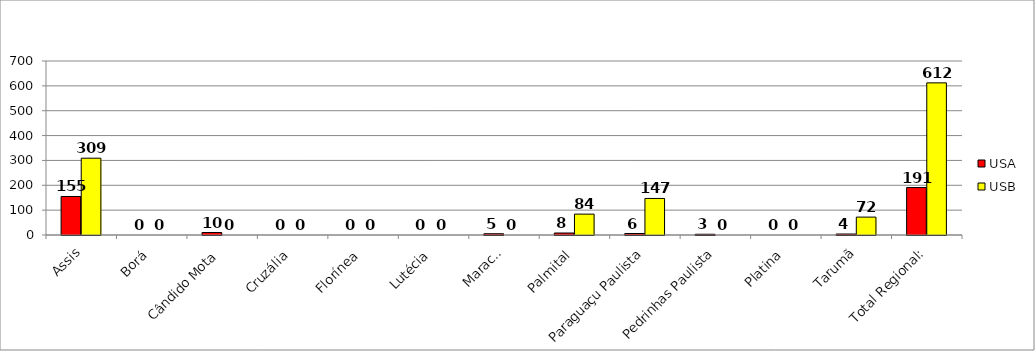
| Category | USA | USB |
|---|---|---|
| Assis | 155 | 309 |
| Borá | 0 | 0 |
| Cândido Mota | 10 | 0 |
| Cruzália | 0 | 0 |
| Florínea | 0 | 0 |
| Lutécia | 0 | 0 |
| Maracaí | 5 | 0 |
| Palmital | 8 | 84 |
| Paraguaçu Paulista | 6 | 147 |
| Pedrinhas Paulista | 3 | 0 |
| Platina | 0 | 0 |
| Tarumã | 4 | 72 |
| Total Regional: | 191 | 612 |